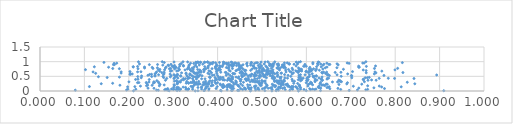
| Category | Series 0 |
|---|---|
| 0.582141139710075 | 0.001 |
| 0.3495802757350073 | 0.002 |
| 0.4737268603509994 | 0.003 |
| 0.5223654341933313 | 0.004 |
| 0.40813077788245833 | 0.005 |
| 0.2105670671386506 | 0.006 |
| 0.3557888218113624 | 0.007 |
| 0.29089348738849996 | 0.008 |
| 0.5318286920843159 | 0.009 |
| 0.9094410686831793 | 0.01 |
| 0.36936956693175504 | 0.011 |
| 0.5996675712360675 | 0.012 |
| 0.5064782676173282 | 0.013 |
| 0.6317352940423241 | 0.014 |
| 0.3089203016600045 | 0.015 |
| 0.4314162559735967 | 0.016 |
| 0.4479037947615978 | 0.017 |
| 0.6963250923186244 | 0.018 |
| 0.4065670241411604 | 0.019 |
| 0.44513351985781235 | 0.02 |
| 0.3705246741478798 | 0.021 |
| 0.3144259787680501 | 0.022 |
| 0.43318102653983936 | 0.023 |
| 0.288357601806005 | 0.024 |
| 0.26655454535400935 | 0.025 |
| 0.5626364845347825 | 0.026 |
| 0.5369191868147039 | 0.027 |
| 0.07950849010189076 | 0.028 |
| 0.4753810688874607 | 0.029 |
| 0.26251503441384094 | 0.03 |
| 0.48556451867947814 | 0.031 |
| 0.38012240410208475 | 0.032 |
| 0.7148820554573792 | 0.033 |
| 0.1949789594021626 | 0.034 |
| 0.4933656561480336 | 0.035 |
| 0.42145989983411447 | 0.036 |
| 0.33284171210089364 | 0.037 |
| 0.28387605466660515 | 0.038 |
| 0.3150480140712266 | 0.039 |
| 0.7338634776630637 | 0.04 |
| 0.2807131998079563 | 0.041 |
| 0.5329868902966289 | 0.042 |
| 0.5523574144378222 | 0.043 |
| 0.45636895759611074 | 0.044 |
| 0.6094020454682313 | 0.045 |
| 0.3130083206218325 | 0.046 |
| 0.6182941228515901 | 0.047 |
| 0.3003468802204504 | 0.048 |
| 0.30660549716492413 | 0.049 |
| 0.46297745644622357 | 0.05 |
| 0.6773085874574951 | 0.051 |
| 0.5945483950353845 | 0.052 |
| 0.737967700108988 | 0.053 |
| 0.34377629353465533 | 0.054 |
| 0.3290095919289643 | 0.055 |
| 0.5689322171382153 | 0.056 |
| 0.49132919459146507 | 0.057 |
| 0.5228810009769183 | 0.058 |
| 0.21576923109753143 | 0.059 |
| 0.30123877514599207 | 0.06 |
| 0.19775095835619783 | 0.061 |
| 0.5868158161294187 | 0.062 |
| 0.2838435536897116 | 0.063 |
| 0.31678545565584626 | 0.064 |
| 0.6214513843545638 | 0.065 |
| 0.6139428046363512 | 0.066 |
| 0.3638898367781136 | 0.067 |
| 0.29625322446013225 | 0.068 |
| 0.5364035525727433 | 0.069 |
| 0.33454719998789273 | 0.07 |
| 0.32920306005317934 | 0.071 |
| 0.33467992717143813 | 0.072 |
| 0.5011330824298915 | 0.073 |
| 0.4721217263693136 | 0.074 |
| 0.38069928558725674 | 0.075 |
| 0.4716416677434123 | 0.076 |
| 0.6527948793628944 | 0.077 |
| 0.6074095658119897 | 0.078 |
| 0.5798697824849146 | 0.079 |
| 0.5675453203064418 | 0.08 |
| 0.28771958751176274 | 0.081 |
| 0.3094251435526989 | 0.082 |
| 0.7758868767139578 | 0.083 |
| 0.45196449467187927 | 0.084 |
| 0.396598318829945 | 0.085 |
| 0.43609269728130373 | 0.086 |
| 0.46242107453480175 | 0.087 |
| 0.4699300082702016 | 0.088 |
| 0.6710617047526071 | 0.089 |
| 0.5467371601324432 | 0.09 |
| 0.4728830178120099 | 0.091 |
| 0.3737012646146979 | 0.092 |
| 0.2566932842593457 | 0.093 |
| 0.5138009522597202 | 0.094 |
| 0.37288532809579455 | 0.095 |
| 0.24335526821800024 | 0.096 |
| 0.49021715796623366 | 0.097 |
| 0.49161706732230515 | 0.098 |
| 0.6322911827397721 | 0.099 |
| 0.7181027620486671 | 0.1 |
| 0.4329127789330708 | 0.101 |
| 0.5416279506372874 | 0.102 |
| 0.5055767193323694 | 0.103 |
| 0.5189437079227599 | 0.104 |
| 0.4603788484887359 | 0.105 |
| 0.4839087349830513 | 0.106 |
| 0.42953232808363473 | 0.107 |
| 0.7520158600358077 | 0.108 |
| 0.30928384143317156 | 0.109 |
| 0.47588627971002817 | 0.11 |
| 0.6283826120613868 | 0.111 |
| 0.3436165904278853 | 0.112 |
| 0.4119706652597852 | 0.113 |
| 0.550839160783977 | 0.114 |
| 0.586921183265626 | 0.115 |
| 0.646464290708315 | 0.116 |
| 0.311989822769993 | 0.117 |
| 0.522163009841785 | 0.118 |
| 0.3081616174076852 | 0.119 |
| 0.35582186515076886 | 0.12 |
| 0.42155018860970117 | 0.121 |
| 0.5654591018167515 | 0.122 |
| 0.6291433841762063 | 0.123 |
| 0.3277966482977437 | 0.124 |
| 0.30096853341503793 | 0.125 |
| 0.5084060724153061 | 0.126 |
| 0.577783120431708 | 0.127 |
| 0.36364780211555936 | 0.128 |
| 0.5378755725435811 | 0.129 |
| 0.5376707903513421 | 0.13 |
| 0.6495409331978454 | 0.131 |
| 0.3223677104191287 | 0.132 |
| 0.5629896756510597 | 0.133 |
| 0.6263823110212408 | 0.134 |
| 0.5698250477042305 | 0.135 |
| 0.42751423807572464 | 0.136 |
| 0.36403715205665654 | 0.137 |
| 0.7694566404534174 | 0.138 |
| 0.4685516766841039 | 0.139 |
| 0.5297777398616206 | 0.14 |
| 0.19733157027032566 | 0.141 |
| 0.8135223035768558 | 0.142 |
| 0.6515872470981136 | 0.143 |
| 0.48439982114740865 | 0.144 |
| 0.41468554775317035 | 0.145 |
| 0.5847481234818757 | 0.146 |
| 0.5758404638236192 | 0.147 |
| 0.4109248214993152 | 0.148 |
| 0.21361034072639473 | 0.149 |
| 0.3991863898416219 | 0.15 |
| 0.11129114966944731 | 0.151 |
| 0.5700423082200544 | 0.152 |
| 0.44838705408500934 | 0.153 |
| 0.43453370566168936 | 0.154 |
| 0.3776407449978484 | 0.155 |
| 0.5670403134836769 | 0.156 |
| 0.3742275121416031 | 0.157 |
| 0.4156293035786417 | 0.158 |
| 0.3401466879162557 | 0.159 |
| 0.43307561800987493 | 0.16 |
| 0.4831727581661388 | 0.161 |
| 0.7057326034192033 | 0.162 |
| 0.5422251049321946 | 0.163 |
| 0.5581273155764761 | 0.164 |
| 0.4135999440693222 | 0.165 |
| 0.22628814626764704 | 0.166 |
| 0.5594682547353861 | 0.167 |
| 0.7641161642455866 | 0.168 |
| 0.6033489990277041 | 0.169 |
| 0.42990012220530416 | 0.17 |
| 0.34524787427285375 | 0.171 |
| 0.6285905010757773 | 0.172 |
| 0.4240455609414432 | 0.173 |
| 0.3851961216383337 | 0.174 |
| 0.5598229546918326 | 0.175 |
| 0.26879582060058194 | 0.176 |
| 0.7379989140204354 | 0.177 |
| 0.23998411081304438 | 0.178 |
| 0.4862173200524079 | 0.179 |
| 0.5307483897301825 | 0.18 |
| 0.5111142047808879 | 0.181 |
| 0.4462608625701583 | 0.182 |
| 0.49671933029662163 | 0.183 |
| 0.3027619908473145 | 0.184 |
| 0.6416359622135563 | 0.185 |
| 0.4295923816914936 | 0.186 |
| 0.4563391013740472 | 0.187 |
| 0.524888104648486 | 0.188 |
| 0.4212887520067211 | 0.189 |
| 0.38728597252564934 | 0.19 |
| 0.4117456827381748 | 0.191 |
| 0.584089731520619 | 0.192 |
| 0.25250112074955877 | 0.193 |
| 0.3896681351571263 | 0.194 |
| 0.6349410641365852 | 0.195 |
| 0.5572974708783398 | 0.196 |
| 0.1800065993816513 | 0.197 |
| 0.5113101603424448 | 0.198 |
| 0.5845028421396219 | 0.199 |
| 0.24260648855731515 | 0.2 |
| 0.5265433428404162 | 0.201 |
| 0.4985982062323574 | 0.202 |
| 0.4728046259445625 | 0.203 |
| 0.6389533559947822 | 0.204 |
| 0.445130679469003 | 0.205 |
| 0.42623808093996585 | 0.206 |
| 0.27968898469615244 | 0.207 |
| 0.5482397115440429 | 0.208 |
| 0.40663731488089017 | 0.209 |
| 0.6139619425657112 | 0.21 |
| 0.4676724199094393 | 0.211 |
| 0.3683524315138641 | 0.212 |
| 0.34830025448490964 | 0.213 |
| 0.6347576892227699 | 0.214 |
| 0.3022467738524244 | 0.215 |
| 0.3668552833398232 | 0.216 |
| 0.4946641771818159 | 0.217 |
| 0.42372499739720104 | 0.218 |
| 0.42769682025302735 | 0.219 |
| 0.544323161300548 | 0.22 |
| 0.5538593116046078 | 0.221 |
| 0.3561081784986808 | 0.222 |
| 0.6734013841022836 | 0.223 |
| 0.41258117977550546 | 0.224 |
| 0.27033424421084606 | 0.225 |
| 0.6039822125289867 | 0.226 |
| 0.43695328471212136 | 0.227 |
| 0.64704710620313 | 0.228 |
| 0.35335381411961597 | 0.229 |
| 0.3794302186610816 | 0.23 |
| 0.5423049715579054 | 0.231 |
| 0.5231855828082776 | 0.232 |
| 0.7247010885582775 | 0.233 |
| 0.370213581533004 | 0.234 |
| 0.34820147909915977 | 0.235 |
| 0.4059187138896573 | 0.236 |
| 0.6446108861973472 | 0.237 |
| 0.36035438476435566 | 0.238 |
| 0.556974681203663 | 0.239 |
| 0.45192421618305145 | 0.24 |
| 0.30924162642860464 | 0.241 |
| 0.690946244379693 | 0.242 |
| 0.37366376188603434 | 0.243 |
| 0.49546428344076276 | 0.244 |
| 0.8441825298235256 | 0.245 |
| 0.44117399960598447 | 0.246 |
| 0.6069957726977897 | 0.247 |
| 0.13793205885170046 | 0.248 |
| 0.6304741690226859 | 0.249 |
| 0.3763206839703872 | 0.25 |
| 0.6110437349291552 | 0.251 |
| 0.24077332526444106 | 0.252 |
| 0.5382501963022109 | 0.253 |
| 0.396294137353695 | 0.254 |
| 0.3802119089189179 | 0.255 |
| 0.35825445550482493 | 0.256 |
| 0.5802186092795267 | 0.257 |
| 0.5081814335368963 | 0.258 |
| 0.5473513449076572 | 0.259 |
| 0.30898186716340414 | 0.26 |
| 0.571526338173244 | 0.261 |
| 0.4971161280751145 | 0.262 |
| 0.16362231463629062 | 0.263 |
| 0.3716735772842168 | 0.264 |
| 0.3347401660909922 | 0.265 |
| 0.30996643646229805 | 0.266 |
| 0.32935302822702506 | 0.267 |
| 0.2554476004166969 | 0.268 |
| 0.5367960560084326 | 0.269 |
| 0.5437184310281443 | 0.27 |
| 0.49988340450915636 | 0.271 |
| 0.6119155997664045 | 0.272 |
| 0.26769661330478833 | 0.273 |
| 0.4932065974122677 | 0.274 |
| 0.37272420752632307 | 0.275 |
| 0.5470800945356655 | 0.276 |
| 0.33431864762466756 | 0.277 |
| 0.535640939892622 | 0.278 |
| 0.38686000871518744 | 0.279 |
| 0.43543877204178605 | 0.28 |
| 0.34898681350068306 | 0.281 |
| 0.5996241009572728 | 0.282 |
| 0.6925134645746068 | 0.283 |
| 0.21961032844131068 | 0.284 |
| 0.4001033276448802 | 0.285 |
| 0.3423267362763923 | 0.286 |
| 0.22272828137656375 | 0.287 |
| 0.35251485848228215 | 0.288 |
| 0.23928670161012788 | 0.289 |
| 0.5381485555475173 | 0.29 |
| 0.39455192221435276 | 0.291 |
| 0.6317405095980919 | 0.292 |
| 0.339381824613331 | 0.293 |
| 0.25801683648663076 | 0.294 |
| 0.44159938331019133 | 0.295 |
| 0.4581569874349215 | 0.296 |
| 0.3450243712863025 | 0.297 |
| 0.8272278571160647 | 0.298 |
| 0.3682397137630089 | 0.299 |
| 0.6095797663408649 | 0.3 |
| 0.48909445325626477 | 0.301 |
| 0.26684125445156404 | 0.302 |
| 0.48437372095452924 | 0.303 |
| 0.3799355234183893 | 0.304 |
| 0.3162244015800382 | 0.305 |
| 0.5448093059282146 | 0.306 |
| 0.24541601289331716 | 0.307 |
| 0.6586806769517011 | 0.308 |
| 0.6702224646378154 | 0.309 |
| 0.4422846513373393 | 0.31 |
| 0.5331869850149923 | 0.311 |
| 0.20030481939787337 | 0.312 |
| 0.30915612296446415 | 0.313 |
| 0.25643613233345885 | 0.314 |
| 0.730626020228624 | 0.315 |
| 0.5475130850366743 | 0.316 |
| 0.6789250224882237 | 0.317 |
| 0.4733137767552621 | 0.318 |
| 0.619447911796592 | 0.319 |
| 0.3133208456182218 | 0.32 |
| 0.6764038943552632 | 0.321 |
| 0.4895191702470236 | 0.322 |
| 0.3467677794572247 | 0.323 |
| 0.48000745248983745 | 0.324 |
| 0.5281389891133526 | 0.325 |
| 0.3305564419595952 | 0.326 |
| 0.5018540417831815 | 0.327 |
| 0.3574613432855115 | 0.328 |
| 0.5056189311269161 | 0.329 |
| 0.43111373460895364 | 0.33 |
| 0.43073857258218184 | 0.331 |
| 0.47759207270291637 | 0.332 |
| 0.45155737942268503 | 0.333 |
| 0.5730513408441904 | 0.334 |
| 0.37290375264922504 | 0.335 |
| 0.49378989300231235 | 0.336 |
| 0.3030850115239916 | 0.337 |
| 0.4859304481674587 | 0.338 |
| 0.5507825701896766 | 0.339 |
| 0.5365428299912833 | 0.34 |
| 0.5687549840725066 | 0.341 |
| 0.507191512772193 | 0.342 |
| 0.4408729505424419 | 0.343 |
| 0.5323535141181718 | 0.344 |
| 0.6021741417031964 | 0.345 |
| 0.3882392316175236 | 0.346 |
| 0.5868312179036583 | 0.347 |
| 0.5393292929158726 | 0.348 |
| 0.5338696022886631 | 0.349 |
| 0.619713084841486 | 0.35 |
| 0.3828709555509654 | 0.351 |
| 0.2632773097996135 | 0.352 |
| 0.5434530604087677 | 0.353 |
| 0.6756997743186679 | 0.354 |
| 0.30742595838173925 | 0.355 |
| 0.4650690126824808 | 0.356 |
| 0.3939886424495749 | 0.357 |
| 0.499583458827218 | 0.358 |
| 0.60047710724895 | 0.359 |
| 0.4649791985266629 | 0.36 |
| 0.635222377489846 | 0.361 |
| 0.421903274774291 | 0.362 |
| 0.4808258245627297 | 0.363 |
| 0.7387690810699901 | 0.364 |
| 0.34537287816061835 | 0.365 |
| 0.28261717351550086 | 0.366 |
| 0.5278195448986736 | 0.367 |
| 0.7570902715959741 | 0.368 |
| 0.6361552912668045 | 0.369 |
| 0.31869065753872483 | 0.37 |
| 0.6729403568620985 | 0.371 |
| 0.6236604939422293 | 0.372 |
| 0.4273978201559674 | 0.373 |
| 0.5893933370325956 | 0.374 |
| 0.41572036425755343 | 0.375 |
| 0.41218771612547966 | 0.376 |
| 0.746806711759602 | 0.377 |
| 0.5496017514519776 | 0.378 |
| 0.476942202036266 | 0.379 |
| 0.4697085271192455 | 0.38 |
| 0.4522963126412356 | 0.381 |
| 0.7286625111478874 | 0.382 |
| 0.32351798078946636 | 0.383 |
| 0.46849239337880555 | 0.384 |
| 0.6039333376707396 | 0.385 |
| 0.581726607263696 | 0.386 |
| 0.4649742776099032 | 0.387 |
| 0.39780074140964705 | 0.388 |
| 0.43095343053725177 | 0.389 |
| 0.4046817166435941 | 0.39 |
| 0.2460689508624445 | 0.391 |
| 0.4132338684099115 | 0.392 |
| 0.428539441953114 | 0.393 |
| 0.21531072473023216 | 0.394 |
| 0.46479125907422414 | 0.395 |
| 0.45238219828964743 | 0.396 |
| 0.45042717183328884 | 0.397 |
| 0.5678249492127335 | 0.398 |
| 0.7278427200130148 | 0.399 |
| 0.6345829181795914 | 0.4 |
| 0.22066018940397358 | 0.401 |
| 0.4031177133639461 | 0.402 |
| 0.4261408379357492 | 0.403 |
| 0.4621526018640194 | 0.404 |
| 0.646455367998685 | 0.405 |
| 0.4338540705380495 | 0.406 |
| 0.6329757324157983 | 0.407 |
| 0.35232357557174065 | 0.408 |
| 0.6196479108851062 | 0.409 |
| 0.40732913021138717 | 0.41 |
| 0.4265423598385044 | 0.411 |
| 0.42381164719738706 | 0.412 |
| 0.5269155286823815 | 0.413 |
| 0.39657616676729046 | 0.414 |
| 0.3717081192003445 | 0.415 |
| 0.3640065609909571 | 0.416 |
| 0.5856875782293702 | 0.417 |
| 0.46388632298225885 | 0.418 |
| 0.33266238009736393 | 0.419 |
| 0.4894074740184813 | 0.42 |
| 0.32725125660836596 | 0.421 |
| 0.48411886784169444 | 0.422 |
| 0.3435516052240163 | 0.423 |
| 0.5890320981193997 | 0.424 |
| 0.3228631187512828 | 0.425 |
| 0.8423185950601009 | 0.426 |
| 0.3017591564053984 | 0.427 |
| 0.28551160198160175 | 0.428 |
| 0.798573898604439 | 0.429 |
| 0.6474183728156682 | 0.43 |
| 0.7639650869691992 | 0.431 |
| 0.5231906211327257 | 0.432 |
| 0.5416584233493278 | 0.433 |
| 0.7845093444699534 | 0.434 |
| 0.6009608825020344 | 0.435 |
| 0.4247103806230329 | 0.436 |
| 0.5928199095437102 | 0.437 |
| 0.5574608106394178 | 0.438 |
| 0.6499952705359414 | 0.439 |
| 0.3344332805210233 | 0.44 |
| 0.3106190136662702 | 0.441 |
| 0.46944186908421415 | 0.442 |
| 0.44667282614148696 | 0.443 |
| 0.5290308904901629 | 0.444 |
| 0.4316723037563669 | 0.445 |
| 0.628411094331844 | 0.446 |
| 0.4942121297970503 | 0.447 |
| 0.551488444713944 | 0.448 |
| 0.509996686396323 | 0.449 |
| 0.7022413114454144 | 0.45 |
| 0.3370737839019897 | 0.451 |
| 0.7323190898981391 | 0.452 |
| 0.2280822489000106 | 0.453 |
| 0.7372219858469273 | 0.454 |
| 0.43382889596779584 | 0.455 |
| 0.278644102518553 | 0.456 |
| 0.3942814649224887 | 0.457 |
| 0.3034005328233894 | 0.458 |
| 0.15127480427120177 | 0.459 |
| 0.3834619360721243 | 0.46 |
| 0.5242541977097801 | 0.461 |
| 0.4120797719060726 | 0.462 |
| 0.5836969732995476 | 0.463 |
| 0.7415632780243586 | 0.464 |
| 0.5400664529209895 | 0.465 |
| 0.35505102556055546 | 0.466 |
| 0.4067415099822409 | 0.467 |
| 0.3815795310747886 | 0.468 |
| 0.4023923303133634 | 0.469 |
| 0.6035963185377393 | 0.47 |
| 0.583216058827219 | 0.471 |
| 0.4416116327619922 | 0.472 |
| 0.17887317141067938 | 0.473 |
| 0.6159031302374931 | 0.474 |
| 0.5266005593192166 | 0.475 |
| 0.5431973914841468 | 0.476 |
| 0.635337860740051 | 0.477 |
| 0.38322874787117545 | 0.478 |
| 0.35067515249631587 | 0.479 |
| 0.29361487552336973 | 0.48 |
| 0.5862460241750527 | 0.481 |
| 0.3325048693631021 | 0.482 |
| 0.44773687580052723 | 0.483 |
| 0.35597778432675187 | 0.484 |
| 0.45530390620975214 | 0.485 |
| 0.1315553664631085 | 0.486 |
| 0.346503052167607 | 0.487 |
| 0.5054463922657874 | 0.488 |
| 0.606310915168616 | 0.489 |
| 0.52320362217272 | 0.49 |
| 0.4330055358307354 | 0.491 |
| 0.22022535735561333 | 0.492 |
| 0.25160940285789224 | 0.493 |
| 0.4560393891348349 | 0.494 |
| 0.48282038096082036 | 0.495 |
| 0.27697929185432746 | 0.496 |
| 0.3077124759948895 | 0.497 |
| 0.5649482801864409 | 0.498 |
| 0.6184421288122849 | 0.499 |
| 0.5344809495076663 | 0.5 |
| 0.6783883568996334 | 0.501 |
| 0.4747956687268151 | 0.502 |
| 0.3573337948446509 | 0.503 |
| 0.31738261711375804 | 0.504 |
| 0.49752248405011834 | 0.505 |
| 0.35771360971717736 | 0.506 |
| 0.25907148983525585 | 0.507 |
| 0.6226128214988683 | 0.508 |
| 0.5036148536307279 | 0.509 |
| 0.4936895980056005 | 0.51 |
| 0.5070442212686973 | 0.511 |
| 0.6148110303080808 | 0.512 |
| 0.2288282690881368 | 0.513 |
| 0.5041847709481572 | 0.514 |
| 0.4835617433418764 | 0.515 |
| 0.4687199189524155 | 0.516 |
| 0.70218676149992 | 0.517 |
| 0.30402019151775406 | 0.518 |
| 0.6220129106122498 | 0.519 |
| 0.3650390977575392 | 0.52 |
| 0.3165314619702133 | 0.521 |
| 0.34225685484411605 | 0.522 |
| 0.5186008472598502 | 0.523 |
| 0.2953726385409119 | 0.524 |
| 0.3308610502515923 | 0.525 |
| 0.7014024901543928 | 0.526 |
| 0.4000462575359899 | 0.527 |
| 0.6517816891374635 | 0.528 |
| 0.42828982717653785 | 0.529 |
| 0.774668410879096 | 0.53 |
| 0.2590333421297134 | 0.531 |
| 0.4876192278814997 | 0.532 |
| 0.5587522353650708 | 0.533 |
| 0.3079460469788349 | 0.534 |
| 0.24308819249781644 | 0.535 |
| 0.45982768348427017 | 0.536 |
| 0.5237801719733687 | 0.537 |
| 0.41944120135579654 | 0.538 |
| 0.38833590059186107 | 0.539 |
| 0.3540516327983697 | 0.54 |
| 0.5832116772750149 | 0.541 |
| 0.4730089908120919 | 0.542 |
| 0.39228000465814883 | 0.543 |
| 0.5356923540421366 | 0.544 |
| 0.4539555906397351 | 0.545 |
| 0.893416713881892 | 0.546 |
| 0.6473781575698623 | 0.547 |
| 0.3096375771952392 | 0.548 |
| 0.48221232522545454 | 0.549 |
| 0.36048853808931214 | 0.55 |
| 0.6690550563441591 | 0.551 |
| 0.5969293486102135 | 0.552 |
| 0.6069094818780374 | 0.553 |
| 0.2671378203202627 | 0.554 |
| 0.3376728629937189 | 0.555 |
| 0.5866356987258216 | 0.556 |
| 0.301840363635522 | 0.557 |
| 0.4955503905578763 | 0.558 |
| 0.5509151885299167 | 0.559 |
| 0.503194938173605 | 0.56 |
| 0.27804496843031157 | 0.561 |
| 0.5083286587763699 | 0.562 |
| 0.6484653188711209 | 0.563 |
| 0.24684482297740462 | 0.564 |
| 0.4772365616236267 | 0.565 |
| 0.2026712966451788 | 0.566 |
| 0.5120822074163947 | 0.567 |
| 0.33795869732460737 | 0.568 |
| 0.3096072493658928 | 0.569 |
| 0.2511837728705293 | 0.57 |
| 0.46454861993601204 | 0.571 |
| 0.484524916497868 | 0.572 |
| 0.5117249085995978 | 0.573 |
| 0.4766423895219172 | 0.574 |
| 0.20470427045130368 | 0.575 |
| 0.3814826043327595 | 0.576 |
| 0.2929918892076403 | 0.577 |
| 0.5676809478173347 | 0.578 |
| 0.4241707536556202 | 0.579 |
| 0.46279165918845766 | 0.58 |
| 0.20779555392547178 | 0.581 |
| 0.6929345180344412 | 0.582 |
| 0.752995053459537 | 0.583 |
| 0.25906061176370365 | 0.584 |
| 0.2794762964496267 | 0.585 |
| 0.33762893504122626 | 0.586 |
| 0.528627115184896 | 0.587 |
| 0.5179888336833182 | 0.588 |
| 0.438515115286331 | 0.589 |
| 0.6130139531138314 | 0.59 |
| 0.32876648162612265 | 0.591 |
| 0.20360289157109457 | 0.592 |
| 0.4362060583815297 | 0.593 |
| 0.5144991844401234 | 0.594 |
| 0.5009615402770388 | 0.595 |
| 0.4626394508675973 | 0.596 |
| 0.6432099231125534 | 0.597 |
| 0.3982535391073201 | 0.598 |
| 0.4340276239114952 | 0.599 |
| 0.34889536910854035 | 0.6 |
| 0.45723823562854016 | 0.601 |
| 0.12542049968927793 | 0.602 |
| 0.5333013399430164 | 0.603 |
| 0.35069665110133164 | 0.604 |
| 0.5429471608997977 | 0.605 |
| 0.37816666424305234 | 0.606 |
| 0.3551140036220978 | 0.607 |
| 0.6358938174677307 | 0.608 |
| 0.2606933092752507 | 0.609 |
| 0.18266224645671703 | 0.61 |
| 0.3291054386394573 | 0.611 |
| 0.5438233321457571 | 0.612 |
| 0.5231035836261614 | 0.613 |
| 0.4844343708123212 | 0.614 |
| 0.346652023789207 | 0.615 |
| 0.5707551260842054 | 0.616 |
| 0.7566478252441219 | 0.617 |
| 0.3188653845602928 | 0.618 |
| 0.49021452951213995 | 0.619 |
| 0.734717012449311 | 0.62 |
| 0.4503523936530871 | 0.621 |
| 0.3861547411932811 | 0.622 |
| 0.3538169999546764 | 0.623 |
| 0.5253832930334859 | 0.624 |
| 0.45485430333755605 | 0.625 |
| 0.5346494016515665 | 0.626 |
| 0.41938244135013525 | 0.627 |
| 0.2743887460661749 | 0.628 |
| 0.8173785903696676 | 0.629 |
| 0.6042137723191603 | 0.63 |
| 0.49487149854443213 | 0.631 |
| 0.5816535743731452 | 0.632 |
| 0.6648279003567339 | 0.633 |
| 0.6346132559114892 | 0.634 |
| 0.4173336349414333 | 0.635 |
| 0.5135281469655693 | 0.636 |
| 0.6777777477269479 | 0.637 |
| 0.5114723785498613 | 0.638 |
| 0.36276980855750884 | 0.639 |
| 0.4071590350308343 | 0.64 |
| 0.35890127707011654 | 0.641 |
| 0.2796958300248047 | 0.642 |
| 0.6455806873580857 | 0.643 |
| 0.5210306647763256 | 0.644 |
| 0.6386914522736798 | 0.645 |
| 0.5656996711712059 | 0.646 |
| 0.5807159965459617 | 0.647 |
| 0.26251528146633873 | 0.648 |
| 0.5541038411022938 | 0.649 |
| 0.11951941320195214 | 0.65 |
| 0.7544443959333561 | 0.651 |
| 0.2197826241881945 | 0.652 |
| 0.18276186251559212 | 0.653 |
| 0.4531352325033827 | 0.654 |
| 0.5102815168993627 | 0.655 |
| 0.227328061332576 | 0.656 |
| 0.36905713974782484 | 0.657 |
| 0.4990826448489385 | 0.658 |
| 0.3974189796619114 | 0.659 |
| 0.5240694674899891 | 0.66 |
| 0.7038661564474005 | 0.661 |
| 0.20269766613626572 | 0.662 |
| 0.45440815472081 | 0.663 |
| 0.598703300410915 | 0.664 |
| 0.6078414510192648 | 0.665 |
| 0.3594944229289898 | 0.666 |
| 0.5790565550480862 | 0.667 |
| 0.5014400084139072 | 0.668 |
| 0.3453736874383668 | 0.669 |
| 0.562427329484723 | 0.67 |
| 0.3427040831019711 | 0.671 |
| 0.26954950953073276 | 0.672 |
| 0.6001720156027947 | 0.673 |
| 0.3833532675378236 | 0.674 |
| 0.48787972890601483 | 0.675 |
| 0.2935614216781116 | 0.676 |
| 0.5160179782030011 | 0.677 |
| 0.7699239955365024 | 0.678 |
| 0.5827808467490073 | 0.679 |
| 0.42845980391627414 | 0.68 |
| 0.5893469889759323 | 0.681 |
| 0.3618619855958285 | 0.682 |
| 0.6067785079625843 | 0.683 |
| 0.30793516595914394 | 0.684 |
| 0.6105820456575741 | 0.685 |
| 0.4929206463668352 | 0.686 |
| 0.38055341442897583 | 0.687 |
| 0.5761809951642463 | 0.688 |
| 0.5201001187988112 | 0.689 |
| 0.296537308188653 | 0.69 |
| 0.4412362865763342 | 0.691 |
| 0.5855757411888142 | 0.692 |
| 0.4611037954416667 | 0.693 |
| 0.5115785083142714 | 0.694 |
| 0.3402074026164842 | 0.695 |
| 0.7345085863025761 | 0.696 |
| 0.6209105531645117 | 0.697 |
| 0.6091040062712141 | 0.698 |
| 0.31166382200080034 | 0.699 |
| 0.5060579436721097 | 0.7 |
| 0.6116338411733803 | 0.701 |
| 0.46352325037410114 | 0.702 |
| 0.474477204626504 | 0.703 |
| 0.3391161420102188 | 0.704 |
| 0.4940250883199917 | 0.705 |
| 0.4258386159254173 | 0.706 |
| 0.6291571355015572 | 0.707 |
| 0.584981875151885 | 0.708 |
| 0.4433269239550127 | 0.709 |
| 0.36971942106583733 | 0.71 |
| 0.40113841242663617 | 0.711 |
| 0.4615689828101269 | 0.712 |
| 0.5112707823214937 | 0.713 |
| 0.4044954304208326 | 0.714 |
| 0.5531908009314297 | 0.715 |
| 0.5393200074422064 | 0.716 |
| 0.7279359364093538 | 0.717 |
| 0.35984986421866005 | 0.718 |
| 0.3266359943596573 | 0.719 |
| 0.7995020799386765 | 0.72 |
| 0.5245821955429059 | 0.721 |
| 0.2806089981921145 | 0.722 |
| 0.2664494920341046 | 0.723 |
| 0.4493530120142639 | 0.724 |
| 0.36870682686841405 | 0.725 |
| 0.4063677747048894 | 0.726 |
| 0.5692391254916583 | 0.727 |
| 0.10244519572534982 | 0.728 |
| 0.3990792021137025 | 0.729 |
| 0.31428907479769874 | 0.73 |
| 0.39703199213097606 | 0.731 |
| 0.3551615524139896 | 0.732 |
| 0.4999943984516244 | 0.733 |
| 0.503333333827917 | 0.734 |
| 0.5596651546127784 | 0.735 |
| 0.6115966335552463 | 0.736 |
| 0.2699540872603342 | 0.737 |
| 0.6075844198551208 | 0.738 |
| 0.5019347557936282 | 0.739 |
| 0.6833539318239894 | 0.74 |
| 0.586634084291912 | 0.741 |
| 0.5890744491482413 | 0.742 |
| 0.3371297079209531 | 0.743 |
| 0.44692427805168755 | 0.744 |
| 0.36952847414702894 | 0.745 |
| 0.5834545126621155 | 0.746 |
| 0.6226346745277807 | 0.747 |
| 0.33188350083658047 | 0.748 |
| 0.34523180594845193 | 0.749 |
| 0.6369534260585453 | 0.75 |
| 0.4497990610747553 | 0.751 |
| 0.5140732011667173 | 0.752 |
| 0.4570568016124369 | 0.753 |
| 0.30325300474505146 | 0.754 |
| 0.47800117222483285 | 0.755 |
| 0.373285720532342 | 0.756 |
| 0.6162631399596282 | 0.757 |
| 0.29135919353719364 | 0.758 |
| 0.2207871864057127 | 0.759 |
| 0.17873610307382282 | 0.76 |
| 0.44957200090137783 | 0.761 |
| 0.42477012368364364 | 0.762 |
| 0.3875473051015782 | 0.763 |
| 0.6063110769347715 | 0.764 |
| 0.4333885415686918 | 0.765 |
| 0.48723308595393233 | 0.766 |
| 0.16385686454313264 | 0.767 |
| 0.7532531016106147 | 0.768 |
| 0.2544129524690716 | 0.769 |
| 0.2943470151933064 | 0.77 |
| 0.5368400498394432 | 0.771 |
| 0.5025309390668238 | 0.772 |
| 0.8055478622796324 | 0.773 |
| 0.4032080681217851 | 0.774 |
| 0.39552881307326493 | 0.775 |
| 0.5344841539886281 | 0.776 |
| 0.5679221398212648 | 0.777 |
| 0.3120769095772966 | 0.778 |
| 0.5212825019471726 | 0.779 |
| 0.48321258789556354 | 0.78 |
| 0.45473241154829847 | 0.781 |
| 0.28223329318874046 | 0.782 |
| 0.3426296106835478 | 0.783 |
| 0.235575247163348 | 0.784 |
| 0.37856351054667126 | 0.785 |
| 0.5823564620007298 | 0.786 |
| 0.5411484901017554 | 0.787 |
| 0.5529380013251919 | 0.788 |
| 0.5339373209059909 | 0.789 |
| 0.6424395833838799 | 0.79 |
| 0.26437392619646094 | 0.791 |
| 0.42340342207848514 | 0.792 |
| 0.49592345048053854 | 0.793 |
| 0.668714662319597 | 0.794 |
| 0.3341360846070438 | 0.795 |
| 0.483244538536059 | 0.796 |
| 0.40404442163964516 | 0.797 |
| 0.4945506858149241 | 0.798 |
| 0.548814380903123 | 0.799 |
| 0.4197939941394816 | 0.8 |
| 0.30549385234656135 | 0.801 |
| 0.49342983187621725 | 0.802 |
| 0.5112773773400109 | 0.803 |
| 0.45042439164503756 | 0.804 |
| 0.25273834334566303 | 0.805 |
| 0.30626216693651775 | 0.806 |
| 0.6078346709978016 | 0.807 |
| 0.7180253599450485 | 0.808 |
| 0.3779629764151462 | 0.809 |
| 0.33431100261476554 | 0.81 |
| 0.15450195635311614 | 0.811 |
| 0.3949765126738072 | 0.812 |
| 0.3011061221526372 | 0.813 |
| 0.4255634170146462 | 0.814 |
| 0.7191203582239285 | 0.815 |
| 0.6463388128101425 | 0.816 |
| 0.235367987322592 | 0.817 |
| 0.20992354680346603 | 0.818 |
| 0.2841669999886125 | 0.819 |
| 0.3533153501334654 | 0.82 |
| 0.4489600395418334 | 0.821 |
| 0.5449650827761429 | 0.822 |
| 0.6334190455113716 | 0.823 |
| 0.34707524194268624 | 0.824 |
| 0.12241918476590163 | 0.825 |
| 0.5504949561966145 | 0.826 |
| 0.20997401633381063 | 0.827 |
| 0.49671480748807173 | 0.828 |
| 0.6230286252235582 | 0.829 |
| 0.37121620006282696 | 0.83 |
| 0.546306452678162 | 0.831 |
| 0.41064953112621394 | 0.832 |
| 0.4330844668759283 | 0.833 |
| 0.3952737563736296 | 0.834 |
| 0.5242016781323601 | 0.835 |
| 0.21982329465919992 | 0.836 |
| 0.5239916959647807 | 0.837 |
| 0.30009284746544895 | 0.838 |
| 0.7350870828481928 | 0.839 |
| 0.45100663834100463 | 0.84 |
| 0.45092543300509824 | 0.841 |
| 0.40719978271832846 | 0.842 |
| 0.5998052221332468 | 0.843 |
| 0.5937262308647713 | 0.844 |
| 0.596279373599937 | 0.845 |
| 0.3145464804590554 | 0.846 |
| 0.7175245258388638 | 0.847 |
| 0.5087207672326263 | 0.848 |
| 0.4812328515330969 | 0.849 |
| 0.2975336622215956 | 0.85 |
| 0.32333056570381946 | 0.851 |
| 0.5768990021581025 | 0.852 |
| 0.7557246536881517 | 0.853 |
| 0.4991215169832687 | 0.854 |
| 0.45368491516080256 | 0.855 |
| 0.3793880926179861 | 0.856 |
| 0.39807056996589496 | 0.857 |
| 0.46696365331003264 | 0.858 |
| 0.4348954029866091 | 0.859 |
| 0.4044368601240923 | 0.86 |
| 0.4791459957196993 | 0.861 |
| 0.5371128598833452 | 0.862 |
| 0.5477804133546744 | 0.863 |
| 0.4427537072852641 | 0.864 |
| 0.2899516697443275 | 0.865 |
| 0.33535567230241836 | 0.866 |
| 0.4917682152268582 | 0.867 |
| 0.5363221981709144 | 0.868 |
| 0.303333318458869 | 0.869 |
| 0.5167791212413307 | 0.87 |
| 0.4251615909523 | 0.871 |
| 0.4357503300643978 | 0.872 |
| 0.5483734020449067 | 0.873 |
| 0.32277646302251695 | 0.874 |
| 0.44962274165830374 | 0.875 |
| 0.5188384389205095 | 0.876 |
| 0.43140051777503696 | 0.877 |
| 0.5371250942152132 | 0.878 |
| 0.6373125900030352 | 0.879 |
| 0.52538026355356 | 0.88 |
| 0.47436460399589764 | 0.881 |
| 0.2765687724587391 | 0.882 |
| 0.5223540839946856 | 0.883 |
| 0.35037314065382186 | 0.884 |
| 0.2885620809145356 | 0.885 |
| 0.5200253045730097 | 0.886 |
| 0.35888588306856484 | 0.887 |
| 0.5502369479319476 | 0.888 |
| 0.4286143245350448 | 0.889 |
| 0.6715537972439215 | 0.89 |
| 0.5457989258522494 | 0.891 |
| 0.6260500436924421 | 0.892 |
| 0.41238393257035255 | 0.893 |
| 0.336253817894964 | 0.894 |
| 0.4573129242192826 | 0.895 |
| 0.44742429138335693 | 0.896 |
| 0.5185032964069654 | 0.897 |
| 0.16542667563136504 | 0.898 |
| 0.24631423027403265 | 0.899 |
| 0.39781627377144424 | 0.9 |
| 0.16773939310418218 | 0.901 |
| 0.2647980585407076 | 0.902 |
| 0.43304768543188443 | 0.903 |
| 0.31463915842386014 | 0.904 |
| 0.6528723337265627 | 0.905 |
| 0.5365189088765254 | 0.906 |
| 0.5966900619589922 | 0.907 |
| 0.6503826801252952 | 0.908 |
| 0.29497835683028995 | 0.909 |
| 0.5721746512273896 | 0.91 |
| 0.4210115979987702 | 0.911 |
| 0.53423790810045 | 0.912 |
| 0.38301266147530544 | 0.913 |
| 0.6394088572340237 | 0.914 |
| 0.36674916149956105 | 0.915 |
| 0.4958269585119386 | 0.916 |
| 0.6323131130438256 | 0.917 |
| 0.5617174387204561 | 0.918 |
| 0.5050190548073682 | 0.919 |
| 0.5799122580780585 | 0.92 |
| 0.5609103997228443 | 0.921 |
| 0.2240493644433602 | 0.922 |
| 0.5240947069380012 | 0.923 |
| 0.4652836914484947 | 0.924 |
| 0.5366399634217084 | 0.925 |
| 0.6690050863816467 | 0.926 |
| 0.38820743527465595 | 0.927 |
| 0.6145525626207329 | 0.928 |
| 0.4369005816470618 | 0.929 |
| 0.5610439563318348 | 0.93 |
| 0.4203473803706209 | 0.931 |
| 0.5168017249405089 | 0.932 |
| 0.43825020547948634 | 0.933 |
| 0.48279488449590446 | 0.934 |
| 0.526828826970505 | 0.935 |
| 0.6250093716376575 | 0.936 |
| 0.474807021665955 | 0.937 |
| 0.3181922798080148 | 0.938 |
| 0.41378309923427303 | 0.939 |
| 0.4433956244775581 | 0.94 |
| 0.34629111656448497 | 0.941 |
| 0.6961453036578349 | 0.942 |
| 0.1669240190912875 | 0.943 |
| 0.4202034856345479 | 0.944 |
| 0.4139867920466662 | 0.945 |
| 0.44740293078196347 | 0.946 |
| 0.17278992093938894 | 0.947 |
| 0.3391050253201321 | 0.948 |
| 0.645957314224021 | 0.949 |
| 0.38175938105684604 | 0.95 |
| 0.7298795250029423 | 0.951 |
| 0.3853085920216489 | 0.952 |
| 0.42460905111271885 | 0.953 |
| 0.7267522132005938 | 0.954 |
| 0.4664578570284581 | 0.955 |
| 0.6918584776432224 | 0.956 |
| 0.5505124603541416 | 0.957 |
| 0.3524838945934161 | 0.958 |
| 0.5568256773077257 | 0.959 |
| 0.3954131304122114 | 0.96 |
| 0.489873556386473 | 0.961 |
| 0.47618405971504196 | 0.962 |
| 0.4392576750397035 | 0.963 |
| 0.486772527439004 | 0.964 |
| 0.41558776188090363 | 0.965 |
| 0.61467650532077 | 0.966 |
| 0.8161058952616109 | 0.967 |
| 0.43268604712334013 | 0.968 |
| 0.3570210967981755 | 0.969 |
| 0.27996301648728394 | 0.97 |
| 0.4040795991607484 | 0.971 |
| 0.35185765471696573 | 0.972 |
| 0.47599094328337166 | 0.973 |
| 0.3615841053436559 | 0.974 |
| 0.14404299041812474 | 0.975 |
| 0.39003185553045183 | 0.976 |
| 0.3711901937840034 | 0.977 |
| 0.6282706228250602 | 0.978 |
| 0.5825923169213953 | 0.979 |
| 0.3614206972862958 | 0.98 |
| 0.3703821229834594 | 0.981 |
| 0.35116954975208203 | 0.982 |
| 0.37698227436653453 | 0.983 |
| 0.5771777130922507 | 0.984 |
| 0.41288270003833016 | 0.985 |
| 0.4978852637165103 | 0.986 |
| 0.4306507667854881 | 0.987 |
| 0.3020099877313943 | 0.988 |
| 0.507005260655764 | 0.989 |
| 0.6267011095288598 | 0.99 |
| 0.33250420297329886 | 0.991 |
| 0.3555532007291863 | 0.992 |
| 0.3777030396413672 | 0.993 |
| 0.528889643447429 | 0.994 |
| 0.22168488999311486 | 0.995 |
| 0.3221308801505699 | 0.996 |
| 0.5132413604125051 | 0.997 |
| 0.7340324286467378 | 0.998 |
| 0.2752893409188747 | 0.999 |
| 0.5867098242235426 | 1 |